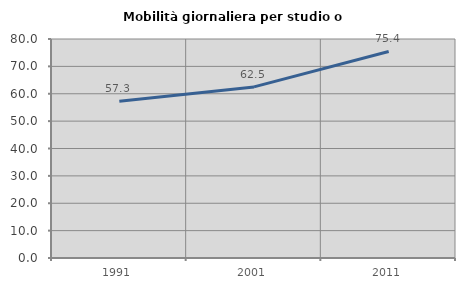
| Category | Mobilità giornaliera per studio o lavoro |
|---|---|
| 1991.0 | 57.292 |
| 2001.0 | 62.5 |
| 2011.0 | 75.439 |